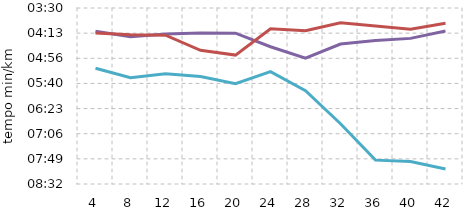
| Category | Series 2 | Series 1 | Series 0 |
|---|---|---|---|
| 4.0 | 0.004 | 0.003 | 0.003 |
| 8.0 | 0.004 | 0.003 | 0.003 |
| 12.0 | 0.004 | 0.003 | 0.003 |
| 16.0 | 0.004 | 0.003 | 0.003 |
| 20.0 | 0.004 | 0.003 | 0.003 |
| 24.0 | 0.004 | 0.003 | 0.003 |
| 28.0 | 0.004 | 0.003 | 0.003 |
| 32.0 | 0.005 | 0.003 | 0.003 |
| 36.0 | 0.005 | 0.003 | 0.003 |
| 40.0 | 0.005 | 0.003 | 0.003 |
| 42.0 | 0.006 | 0.003 | 0.003 |